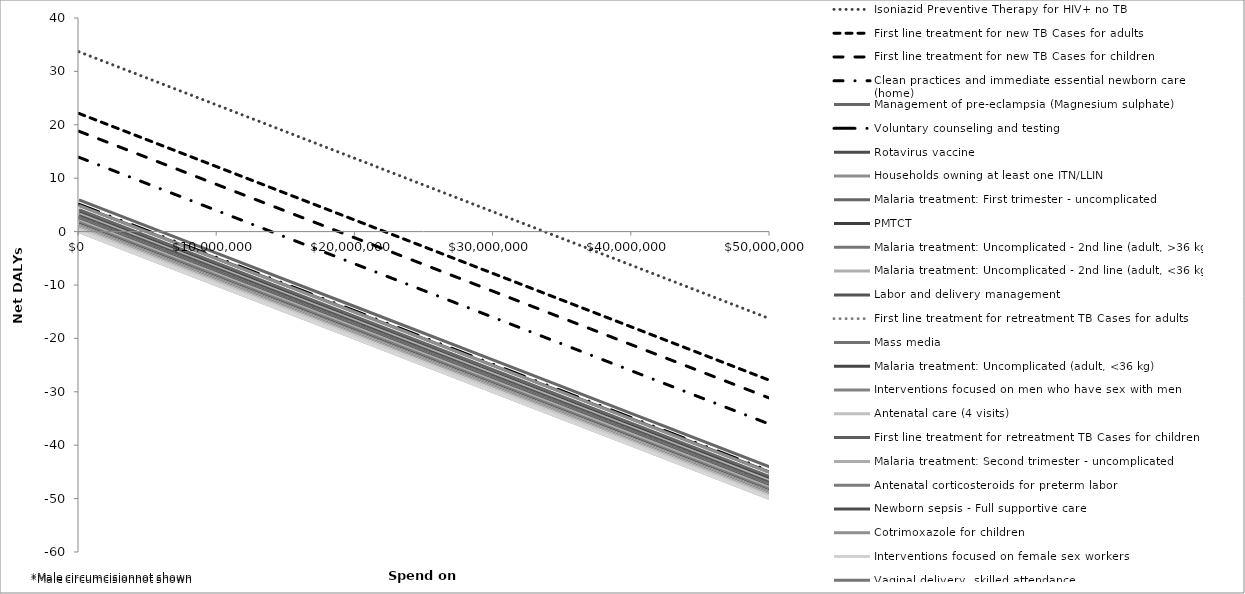
| Category | Isoniazid Preventive Therapy for HIV+ no TB | First line treatment for new TB Cases for adults | First line treatment for new TB Cases for children | Clean practices and immediate essential newborn care (home) | Management of pre-eclampsia (Magnesium sulphate) | Voluntary counseling and testing | Rotavirus vaccine | Households owning at least one ITN/LLIN | Malaria treatment: First trimester - uncomplicated | PMTCT | Malaria treatment: Uncomplicated - 2nd line (adult, >36 kg) | Malaria treatment: Uncomplicated - 2nd line (adult, <36 kg) | Labor and delivery management | First line treatment for retreatment TB Cases for adults | Mass media | Malaria treatment: Uncomplicated (adult, <36 kg) | Interventions focused on men who have sex with men | Antenatal care (4 visits) | First line treatment for retreatment TB Cases for children | Malaria treatment: Second trimester - uncomplicated | Antenatal corticosteroids for preterm labor | Newborn sepsis - Full supportive care | Cotrimoxazole for children | Interventions focused on female sex workers | Vaginal delivery, skilled attendance | Malaria treatment: Uncomplicated (adult, >36 kg) | Tetanus toxoid (pregnant women) | Malaria treatment: Uncomplicated - 2nd line (children, <15 kg) | Malaria treatment: Uncomplicated - 2nd line (children, >15 kg) | Schistosomiasis Mass drug administration | Vitamin A supplementation in pregnant women | Malaria treatment: Uncomplicated (children, >15 kg) | Antibiotics for pPRoM | Maternal Sepsis case management | Management of severe malnutrition (children) | Isoniazid Preventive Therapy for children in contact with TB patients | Malaria treatment: Uncomplicated (children, <15 kg) | Vaginal Delivery, with complication | Measles vaccine | Management of obstructed labor | Cesearian section | Cesearian section (with complication) | Pregnant women sleeping under an ITN | Under five children who slept under ITN/LLIN | Blood safety | Malaria treatment: Pregnant Women - complicated | Case management of MDR TB cases |
|---|---|---|---|---|---|---|---|---|---|---|---|---|---|---|---|---|---|---|---|---|---|---|---|---|---|---|---|---|---|---|---|---|---|---|---|---|---|---|---|---|---|---|---|---|---|---|---|
| 0.0 | 33672878.743 | 22122152.141 | 18788596.835 | 13909438.15 | 5922852.031 | 5119997.842 | 4919790.003 | 4846582.14 | 4087451.039 | 3560624.949 | 3353500.128 | 3285408.755 | 2992465.443 | 2688491.091 | 2626919.91 | 2383198.06 | 2310887.573 | 2289379.707 | 2283350.242 | 2046789.576 | 1717752.097 | 1345802.136 | 1208246.698 | 1184253.926 | 1153015.82 | 1021370.597 | 905196.42 | 799430.656 | 783198.561 | 670393.13 | 633693.703 | 486962.836 | 449676.309 | 449254.718 | 445853.35 | 408126.992 | 324641.891 | 242133.322 | 55347.293 | 0 | 0 | 0 | 0 | 0 | 0 | 0 | 0 |
| 10000000.0 | 23672878.743 | 12122152.141 | 8788596.835 | 3909438.15 | -4077147.969 | -4880002.158 | -5080209.997 | -5153417.86 | -5912548.961 | -6439375.051 | -6646499.872 | -6714591.245 | -7007534.557 | -7311508.909 | -7373080.09 | -7616801.94 | -7689112.427 | -7710620.293 | -7716649.758 | -7953210.424 | -8282247.903 | -8654197.864 | -8791753.302 | -8815746.074 | -8846984.18 | -8978629.403 | -9094803.58 | -9200569.344 | -9216801.439 | -9329606.87 | -9366306.297 | -9513037.164 | -9550323.691 | -9550745.282 | -9554146.65 | -9591873.008 | -9675358.109 | -9757866.678 | -9944652.707 | -10000000 | -10000000 | -10000000 | -10000000 | -10000000 | -10000000 | -10000000 | -10000000 |
| 20000000.0 | 13672878.743 | 2122152.141 | -1211403.165 | -6090561.85 | -14077147.969 | -14880002.158 | -15080209.997 | -15153417.86 | -15912548.961 | -16439375.051 | -16646499.872 | -16714591.245 | -17007534.557 | -17311508.909 | -17373080.09 | -17616801.94 | -17689112.427 | -17710620.293 | -17716649.758 | -17953210.424 | -18282247.903 | -18654197.864 | -18791753.302 | -18815746.074 | -18846984.18 | -18978629.403 | -19094803.58 | -19200569.344 | -19216801.439 | -19329606.87 | -19366306.297 | -19513037.164 | -19550323.691 | -19550745.282 | -19554146.65 | -19591873.008 | -19675358.109 | -19757866.678 | -19944652.707 | -20000000 | -20000000 | -20000000 | -20000000 | -20000000 | -20000000 | -20000000 | -20000000 |
| 30000000.0 | 3672878.743 | -7877847.859 | -11211403.165 | -16090561.85 | -24077147.969 | -24880002.158 | -25080209.997 | -25153417.86 | -25912548.961 | -26439375.051 | -26646499.872 | -26714591.245 | -27007534.557 | -27311508.909 | -27373080.09 | -27616801.94 | -27689112.427 | -27710620.293 | -27716649.758 | -27953210.424 | -28282247.903 | -28654197.864 | -28791753.302 | -28815746.074 | -28846984.18 | -28978629.403 | -29094803.58 | -29200569.344 | -29216801.439 | -29329606.87 | -29366306.297 | -29513037.164 | -29550323.691 | -29550745.282 | -29554146.65 | -29591873.008 | -29675358.109 | -29757866.678 | -29944652.707 | -30000000 | -30000000 | -30000000 | -30000000 | -30000000 | -30000000 | -30000000 | -30000000 |
| 40000000.0 | -6327121.257 | -17877847.859 | -21211403.165 | -26090561.85 | -34077147.969 | -34880002.158 | -35080209.997 | -35153417.86 | -35912548.961 | -36439375.051 | -36646499.872 | -36714591.245 | -37007534.557 | -37311508.909 | -37373080.09 | -37616801.94 | -37689112.427 | -37710620.293 | -37716649.758 | -37953210.424 | -38282247.903 | -38654197.864 | -38791753.302 | -38815746.074 | -38846984.18 | -38978629.403 | -39094803.58 | -39200569.344 | -39216801.439 | -39329606.87 | -39366306.297 | -39513037.164 | -39550323.691 | -39550745.282 | -39554146.65 | -39591873.008 | -39675358.109 | -39757866.678 | -39944652.707 | -40000000 | -40000000 | -40000000 | -40000000 | -40000000 | -40000000 | -40000000 | -40000000 |
| 50000000.0 | -16327121.257 | -27877847.859 | -31211403.165 | -36090561.85 | -44077147.969 | -44880002.158 | -45080209.997 | -45153417.86 | -45912548.961 | -46439375.051 | -46646499.872 | -46714591.245 | -47007534.557 | -47311508.909 | -47373080.09 | -47616801.94 | -47689112.427 | -47710620.293 | -47716649.758 | -47953210.424 | -48282247.903 | -48654197.864 | -48791753.302 | -48815746.074 | -48846984.18 | -48978629.403 | -49094803.58 | -49200569.344 | -49216801.439 | -49329606.87 | -49366306.297 | -49513037.164 | -49550323.691 | -49550745.282 | -49554146.65 | -49591873.008 | -49675358.109 | -49757866.678 | -49944652.707 | -50000000 | -50000000 | -50000000 | -50000000 | -50000000 | -50000000 | -50000000 | -50000000 |